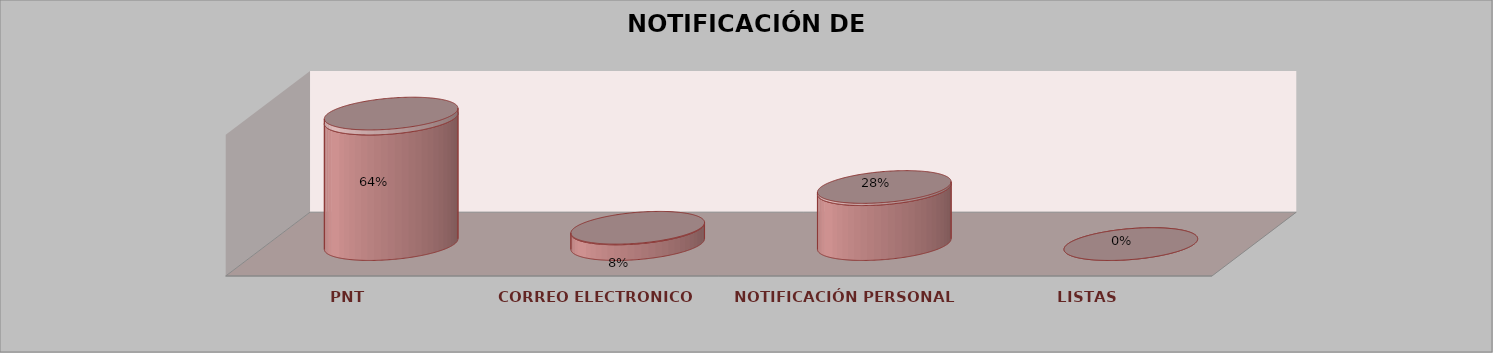
| Category | Series 0 | Series 1 | Series 2 | Series 3 | Series 4 |
|---|---|---|---|---|---|
| PNT |  |  |  | 16 | 0.64 |
| CORREO ELECTRONICO |  |  |  | 2 | 0.08 |
| NOTIFICACIÓN PERSONAL |  |  |  | 7 | 0.28 |
| LISTAS |  |  |  | 0 | 0 |